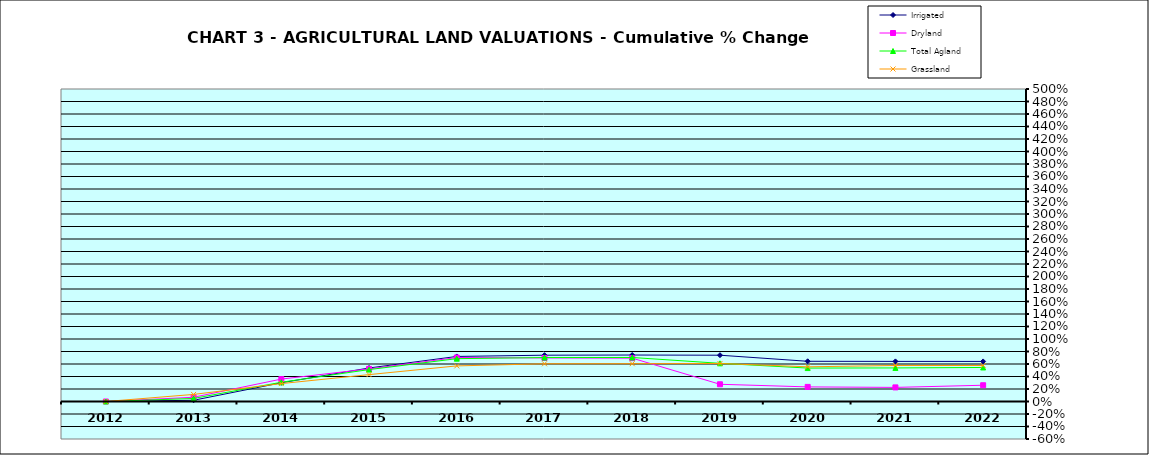
| Category | Irrigated | Dryland | Total Agland | Grassland |
|---|---|---|---|---|
| 2012.0 | 0 | 0 | 0 | 0 |
| 2013.0 | 0.02 | 0.068 | 0.049 | 0.113 |
| 2014.0 | 0.3 | 0.359 | 0.308 | 0.287 |
| 2015.0 | 0.536 | 0.522 | 0.51 | 0.43 |
| 2016.0 | 0.721 | 0.704 | 0.685 | 0.57 |
| 2017.0 | 0.741 | 0.696 | 0.703 | 0.604 |
| 2018.0 | 0.744 | 0.694 | 0.704 | 0.605 |
| 2019.0 | 0.741 | 0.276 | 0.611 | 0.608 |
| 2020.0 | 0.643 | 0.234 | 0.535 | 0.555 |
| 2021.0 | 0.642 | 0.226 | 0.537 | 0.576 |
| 2022.0 | 0.641 | 0.26 | 0.544 | 0.576 |